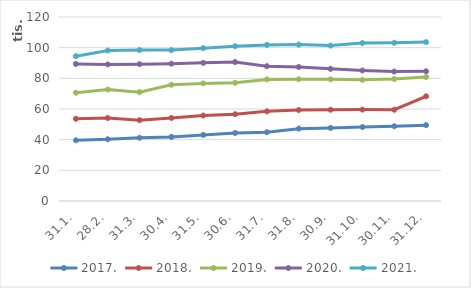
| Category | 2017. | 2018. | 2019. | 2020. | 2021. |
|---|---|---|---|---|---|
| 31.1. | 39595 | 53611 | 70573 | 89403 | 94449 |
| 28.2. | 40260 | 54109 | 72693 | 89083 | 98152 |
| 31.3. | 41220 | 52707 | 70989 | 89252 | 98467 |
| 30.4. | 41783 | 54162 | 75819 | 89567 | 98416 |
| 31.5. | 43082 | 55739 | 76699 | 90103 | 99656 |
| 30.6. | 44387 | 56615 | 77072 | 90615 | 100981 |
| 31.7. | 44864 | 58482 | 79301 | 87942 | 101798 |
| 31.8. | 47191 | 59349 | 79413 | 87408 | 101991 |
| 30.9. | 47669 | 59513 | 79325 | 86216 | 101342 |
| 31.10. | 48229 | 59593 | 79013 | 85116 | 103000 |
| 30.11. | 48750 | 59522 | 79561 | 84424 | 103180 |
| 31.12. | 49476 | 68284 | 80884 | 84624 | 103615 |